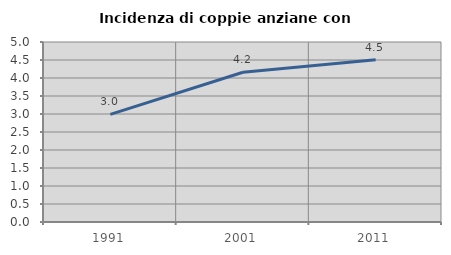
| Category | Incidenza di coppie anziane con figli |
|---|---|
| 1991.0 | 2.989 |
| 2001.0 | 4.159 |
| 2011.0 | 4.508 |